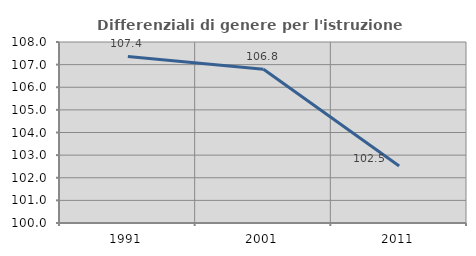
| Category | Differenziali di genere per l'istruzione superiore |
|---|---|
| 1991.0 | 107.363 |
| 2001.0 | 106.797 |
| 2011.0 | 102.52 |